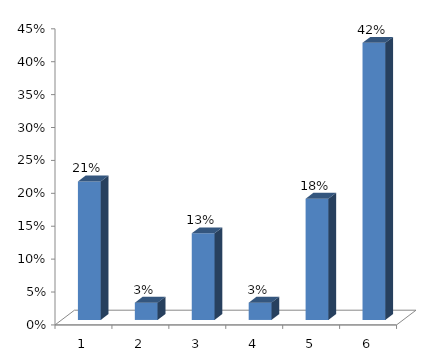
| Category | Series 0 |
|---|---|
| 0 | 0.211 |
| 1 | 0.026 |
| 2 | 0.132 |
| 3 | 0.026 |
| 4 | 0.184 |
| 5 | 0.421 |